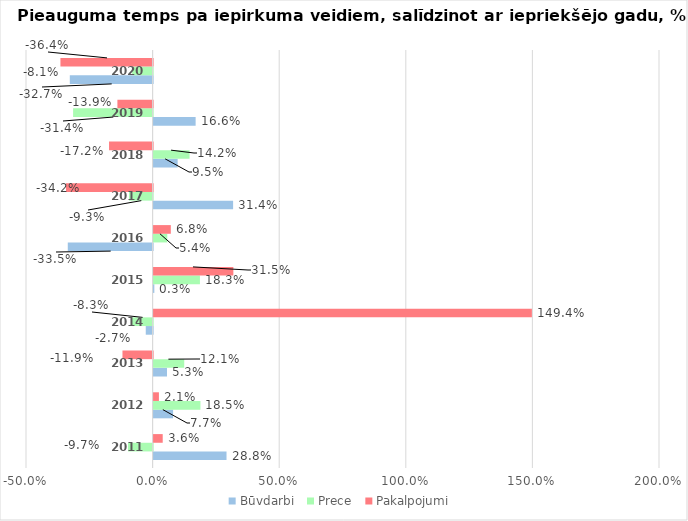
| Category | Būvdarbi | Prece | Pakalpojumi |
|---|---|---|---|
| 2011.0 | 0.288 | -0.097 | 0.036 |
| 2012.0 | 0.077 | 0.185 | 0.021 |
| 2013.0 | 0.053 | 0.121 | -0.119 |
| 2014.0 | -0.027 | -0.083 | 1.494 |
| 2015.0 | 0.003 | 0.183 | 0.315 |
| 2016.0 | -0.335 | 0.054 | 0.068 |
| 2017.0 | 0.314 | -0.093 | -0.342 |
| 2018.0 | 0.095 | 0.142 | -0.172 |
| 2019.0 | 0.166 | -0.314 | -0.139 |
| 2020.0 | -0.327 | -0.081 | -0.364 |